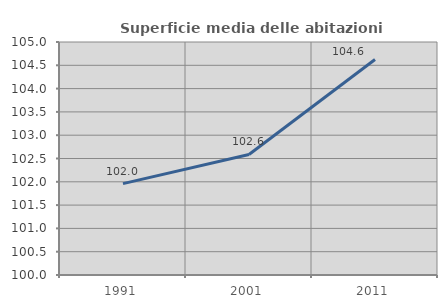
| Category | Superficie media delle abitazioni occupate |
|---|---|
| 1991.0 | 101.961 |
| 2001.0 | 102.587 |
| 2011.0 | 104.624 |